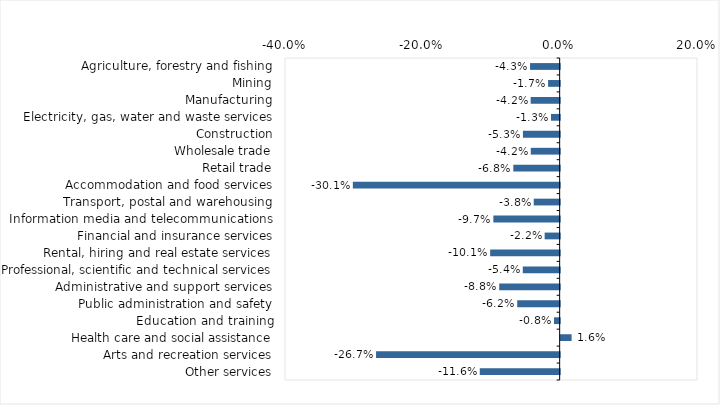
| Category | This week |
|---|---|
| Agriculture, forestry and fishing | -0.043 |
| Mining | -0.017 |
| Manufacturing | -0.042 |
| Electricity, gas, water and waste services | -0.013 |
| Construction | -0.053 |
| Wholesale trade | -0.042 |
| Retail trade | -0.068 |
| Accommodation and food services | -0.301 |
| Transport, postal and warehousing | -0.038 |
| Information media and telecommunications | -0.097 |
| Financial and insurance services | -0.022 |
| Rental, hiring and real estate services | -0.101 |
| Professional, scientific and technical services | -0.054 |
| Administrative and support services | -0.088 |
| Public administration and safety | -0.062 |
| Education and training | -0.008 |
| Health care and social assistance | 0.016 |
| Arts and recreation services | -0.267 |
| Other services | -0.116 |